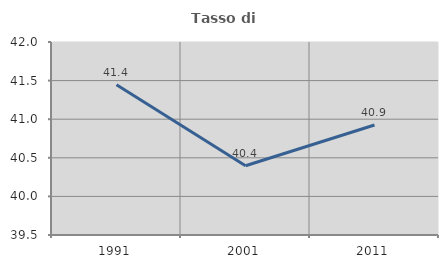
| Category | Tasso di occupazione   |
|---|---|
| 1991.0 | 41.445 |
| 2001.0 | 40.397 |
| 2011.0 | 40.926 |